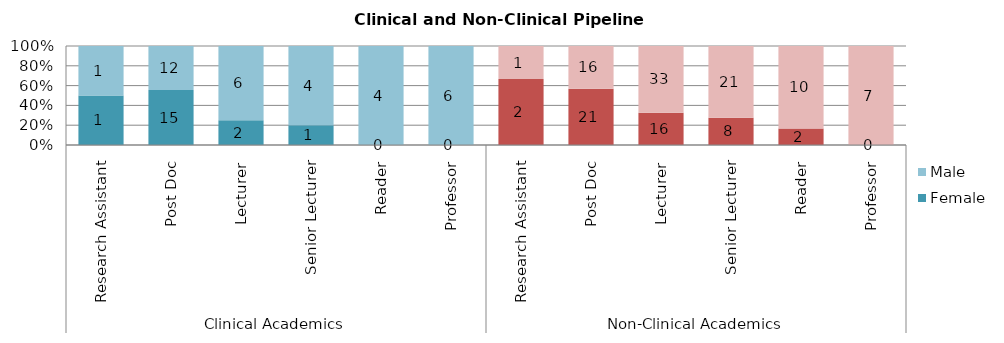
| Category | Female | Male |
|---|---|---|
| 0 | 1 | 1 |
| 1 | 15 | 12 |
| 2 | 2 | 6 |
| 3 | 1 | 4 |
| 4 | 0 | 4 |
| 5 | 0 | 6 |
| 6 | 2 | 1 |
| 7 | 21 | 16 |
| 8 | 16 | 33 |
| 9 | 8 | 21 |
| 10 | 2 | 10 |
| 11 | 0 | 7 |